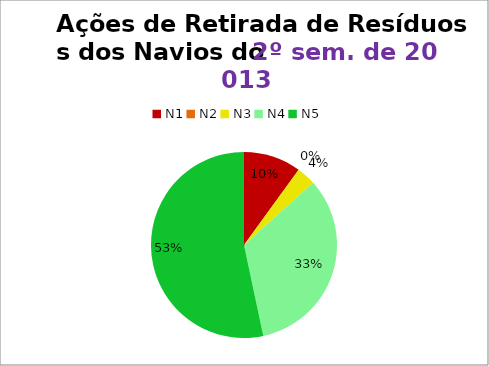
| Category | 2º/13 |
|---|---|
| N1 | 3 |
| N2 | 0 |
| N3 | 1 |
| N4 | 10 |
| N5 | 16 |